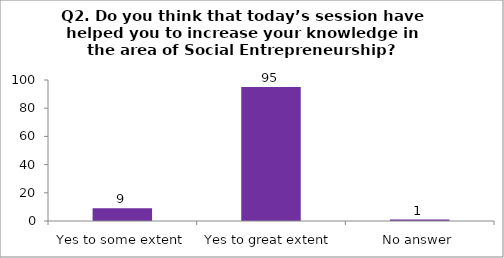
| Category | Q2. Do you think that today’s session have helped you to increase your knowledge in the area of Social Entrepreneurship? |
|---|---|
| Yes to some extent | 9 |
| Yes to great extent | 95 |
| No answer | 1 |